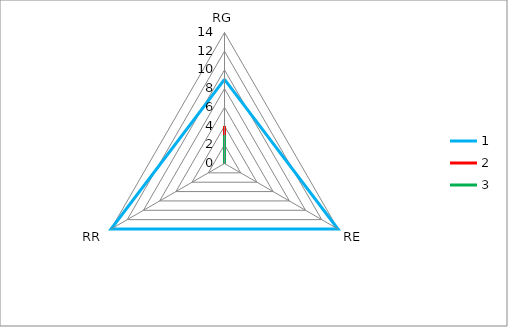
| Category | 1 | 2 | 3 |
|---|---|---|---|
| 0 | 9 | 4 | 3 |
| 1 | 14 | 0 | 0 |
| 2 | 14 | 0 | 0 |